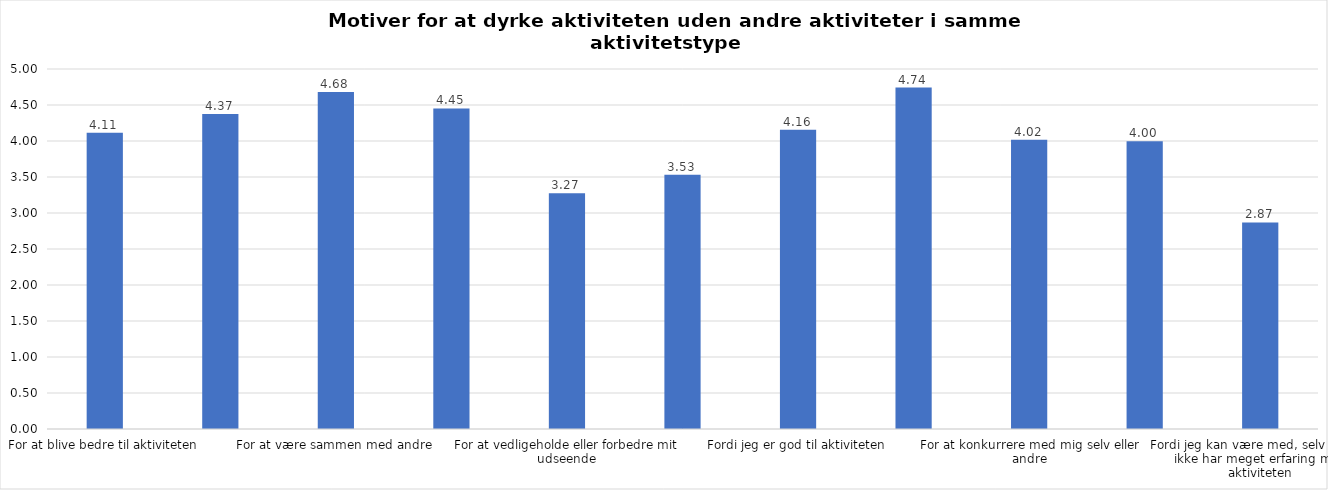
| Category | Gennemsnit |
|---|---|
| For at blive bedre til aktiviteten | 4.113 |
| For at vedligeholde eller forbedre min sundhed (fx helbred, fysisk form) | 4.375 |
| For at være sammen med andre | 4.68 |
| For at gøre noget godt for mig selv | 4.452 |
| For at vedligeholde eller forbedre mit udseende | 3.273 |
| Fordi andre i min omgangskreds opmuntrer mig til det | 3.531 |
| Fordi jeg er god til aktiviteten | 4.156 |
| Fordi jeg godt kan lide aktiviteten | 4.743 |
| For at konkurrere med mig selv eller andre | 4.019 |
| Fordi aktiviteten passer godt ind i min hverdag | 3.995 |
| Fordi jeg kan være med, selv om jeg ikke har meget erfaring med aktiviteten | 2.869 |